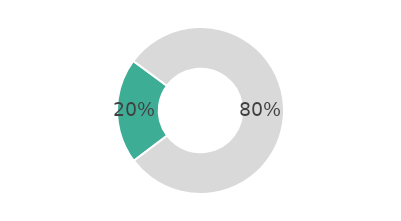
| Category | Series 0 |
|---|---|
| 0 | 20.383 |
| 1 | 79.617 |